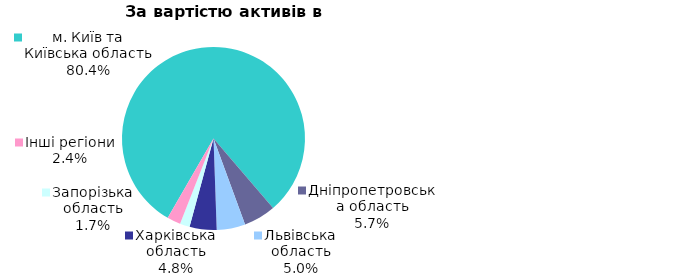
| Category | Series 0 |
|---|---|
| м. Київ та Київська область | 0.804 |
| Дніпропетровська область | 0.057 |
| Львівська область | 0.05 |
| Харківська область | 0.048 |
| Запорізька область | 0.017 |
| Інші регіони | 0.024 |